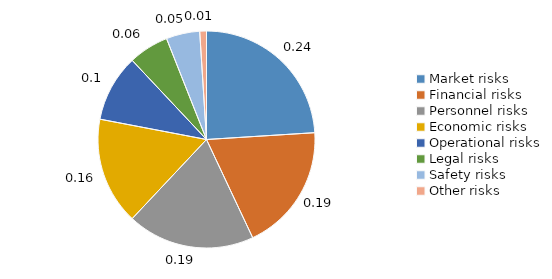
| Category | Series 0 |
|---|---|
| Market risks | 0.24 |
| Financial risks | 0.19 |
| Personnel risks | 0.19 |
| Economic risks | 0.16 |
| Operational risks | 0.1 |
| Legal risks | 0.06 |
| Safety risks | 0.05 |
| Other risks | 0.01 |